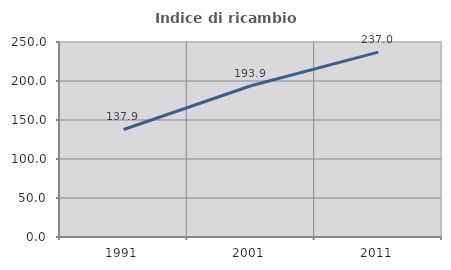
| Category | Indice di ricambio occupazionale  |
|---|---|
| 1991.0 | 137.868 |
| 2001.0 | 193.922 |
| 2011.0 | 236.975 |